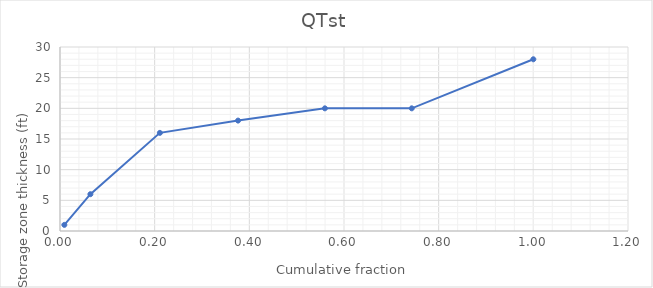
| Category | Series 0 |
|---|---|
| 0.009174311926605505 | 1 |
| 0.06422018348623854 | 6 |
| 0.21100917431192662 | 16 |
| 0.3761467889908257 | 18 |
| 0.5596330275229358 | 20 |
| 0.7431192660550459 | 20 |
| 1.0 | 28 |